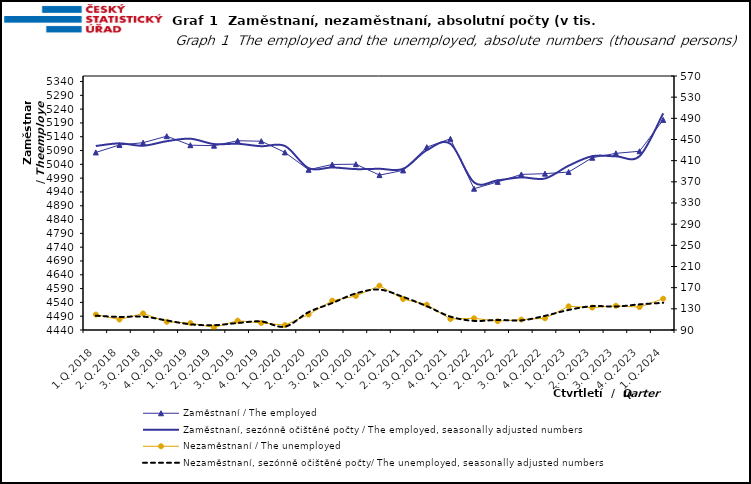
| Category | Zaměstnaní / The employed | Zaměstnaní, sezónně očištěné počty / The employed, seasonally adjusted numbers |
|---|---|---|
| 1.Q.2018 | 5083.179 | 5106.523 |
| 2.Q.2018 | 5110.163 | 5115.918 |
| 3.Q.2018 | 5118.428 | 5107.483 |
| 4.Q.2018 | 5142.05 | 5123.824 |
| 1.Q.2019 | 5109.352 | 5132.797 |
| 2.Q.2019 | 5107.692 | 5113.449 |
| 3.Q.2019 | 5125.549 | 5114.578 |
| 4.Q.2019 | 5123.768 | 5105.63 |
| 1.Q.2020 | 5083.305 | 5106.624 |
| 2.Q.2020 | 5020.458 | 5026.112 |
| 3.Q.2020 | 5039.545 | 5028.75 |
| 4.Q.2020 | 5040.581 | 5022.761 |
| 1.Q.2021 | 5001.014 | 5023.933 |
| 2.Q.2021 | 5018.083 | 5023.732 |
| 3.Q.2021 | 5102.241 | 5091.319 |
| 4.Q.2021 | 5132.436 | 5114.325 |
| 1.Q.2022 | 4951.782 | 4974.435 |
| 2.Q.2022 | 4976.521 | 4982.107 |
| 3.Q.2022 | 5003.507 | 4992.806 |
| 4.Q.2022 | 5006.314 | 4988.719 |
| 1.Q.2023 | 5012.111 | 5034.975 |
| 2.Q.2023 | 5063.915 | 5069.578 |
| 3.Q.2023 | 5079.916 | 5069.073 |
| 4.Q.2023 | 5087.44 | 5069.63 |
| 1.Q.2024 | 5201.013 | 5224.659 |